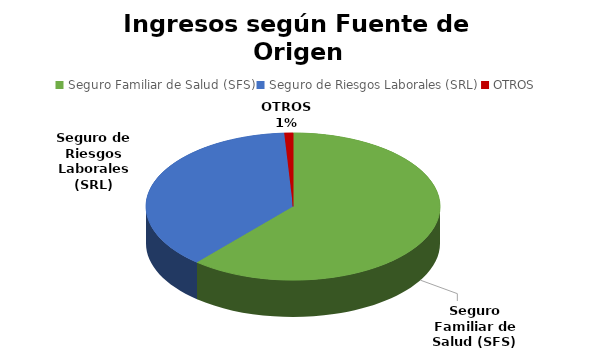
| Category | Series 0 |
|---|---|
| Seguro Familiar de Salud (SFS) | 383770284.44 |
| Seguro de Riesgos Laborales (SRL) | 236103340.09 |
| OTROS | 5949846.39 |